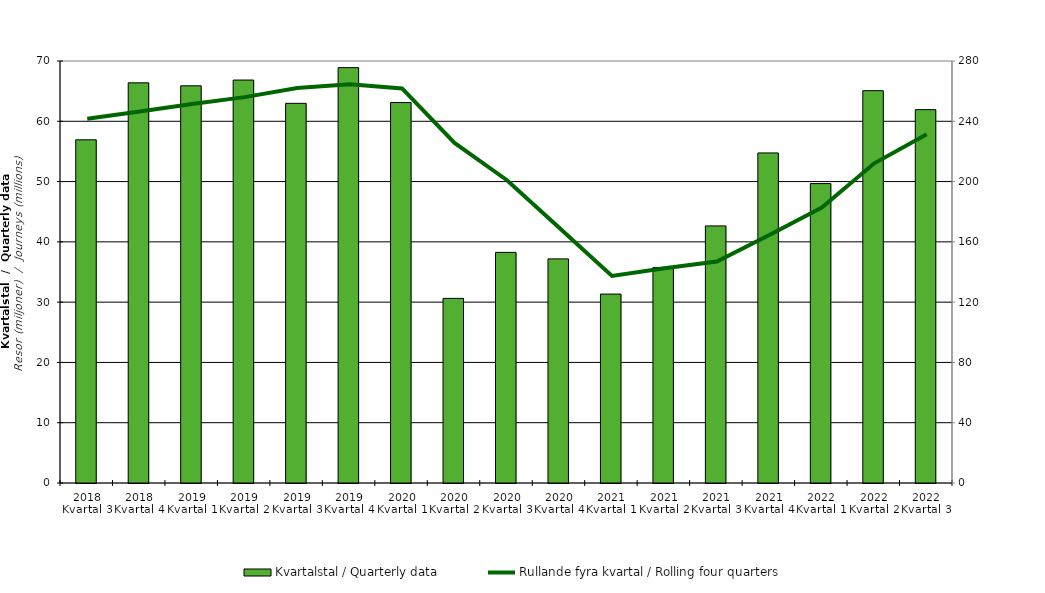
| Category | Kvartalstal / Quarterly data |
|---|---|
| 2018 Kvartal 3 | 56.927 |
| 2018 Kvartal 4 | 66.378 |
| 2019 Kvartal 1 | 65.885 |
| 2019 Kvartal 2 | 66.84 |
| 2019 Kvartal 3 | 62.979 |
| 2019 Kvartal 4 | 68.898 |
| 2020 Kvartal 1 | 63.109 |
| 2020 Kvartal 2 | 30.624 |
| 2020 Kvartal 3 | 38.255 |
| 2020 Kvartal 4 | 37.175 |
| 2021 Kvartal 1 | 31.339 |
| 2021 Kvartal 2 | 35.757 |
| 2021 Kvartal 3 | 42.645 |
| 2021 Kvartal 4 | 54.75 |
| 2022 Kvartal 1 | 49.665 |
| 2022 Kvartal 2 | 65.076 |
| 2022 Kvartal 3 | 61.934 |